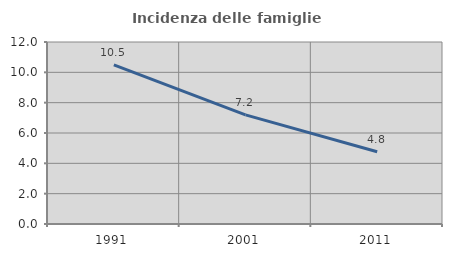
| Category | Incidenza delle famiglie numerose |
|---|---|
| 1991.0 | 10.487 |
| 2001.0 | 7.194 |
| 2011.0 | 4.762 |